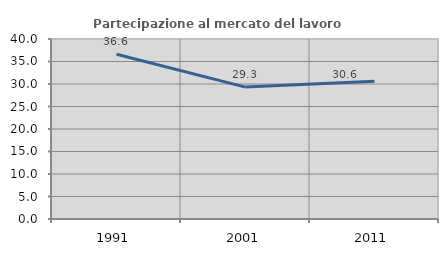
| Category | Partecipazione al mercato del lavoro  femminile |
|---|---|
| 1991.0 | 36.628 |
| 2001.0 | 29.313 |
| 2011.0 | 30.609 |